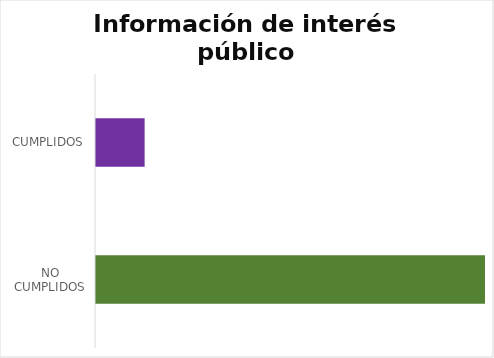
| Category | Series 0 |
|---|---|
| NO CUMPLIDOS | 8 |
| CUMPLIDOS | 1 |